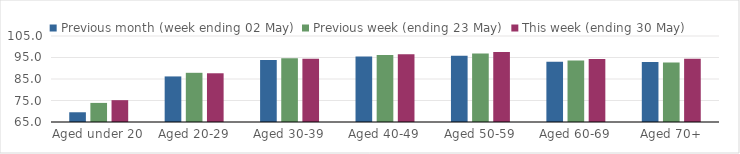
| Category | Previous month (week ending 02 May) | Previous week (ending 23 May) | This week (ending 30 May) |
|---|---|---|---|
| Aged under 20 | 69.528 | 73.881 | 75.158 |
| Aged 20-29 | 86.195 | 87.882 | 87.664 |
| Aged 30-39 | 93.816 | 94.67 | 94.445 |
| Aged 40-49 | 95.413 | 96.163 | 96.474 |
| Aged 50-59 | 95.866 | 96.917 | 97.604 |
| Aged 60-69 | 93.073 | 93.639 | 94.278 |
| Aged 70+ | 92.884 | 92.663 | 94.373 |